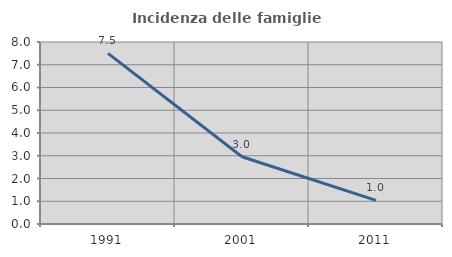
| Category | Incidenza delle famiglie numerose |
|---|---|
| 1991.0 | 7.5 |
| 2001.0 | 2.957 |
| 2011.0 | 1.037 |